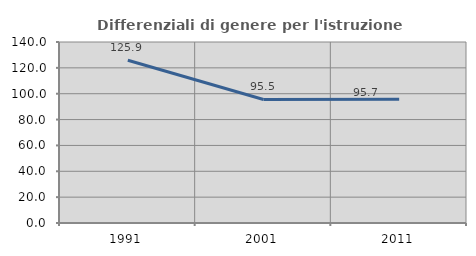
| Category | Differenziali di genere per l'istruzione superiore |
|---|---|
| 1991.0 | 125.85 |
| 2001.0 | 95.527 |
| 2011.0 | 95.688 |